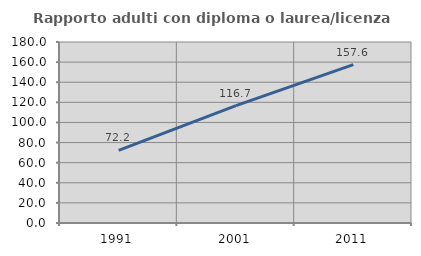
| Category | Rapporto adulti con diploma o laurea/licenza media  |
|---|---|
| 1991.0 | 72.248 |
| 2001.0 | 116.685 |
| 2011.0 | 157.562 |